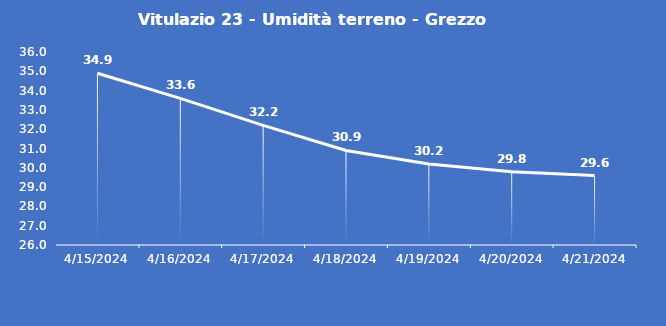
| Category | Vitulazio 23 - Umidità terreno - Grezzo (%VWC) |
|---|---|
| 4/15/24 | 34.9 |
| 4/16/24 | 33.6 |
| 4/17/24 | 32.2 |
| 4/18/24 | 30.9 |
| 4/19/24 | 30.2 |
| 4/20/24 | 29.8 |
| 4/21/24 | 29.6 |